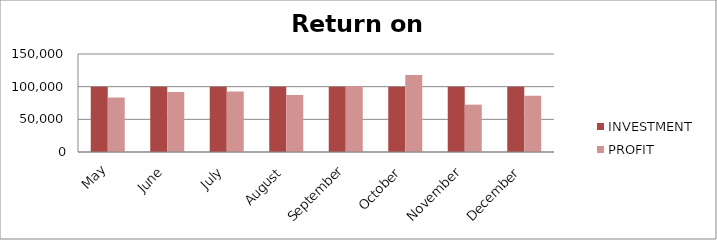
| Category | INVESTMENT  | PROFIT |
|---|---|---|
| May | 100000 | 83275 |
| June | 100000 | 91850 |
| July | 100000 | 92549 |
| August | 100000 | 87395 |
| September | 100000 | 101179 |
| October | 100000 | 117981 |
| November | 100000 | 72507 |
| December | 100000 | 85934 |